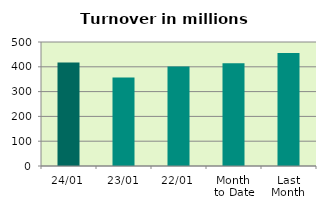
| Category | Series 0 |
|---|---|
| 24/01 | 417.395 |
| 23/01 | 357.124 |
| 22/01 | 400.776 |
| Month 
to Date | 413.921 |
| Last
Month | 455.699 |